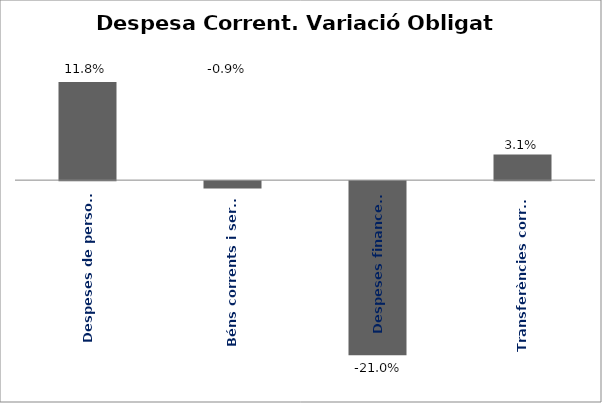
| Category | Series 0 |
|---|---|
| Despeses de personal | 0.118 |
| Béns corrents i serveis | -0.009 |
| Despeses financeres | -0.21 |
| Transferències corrents | 0.031 |